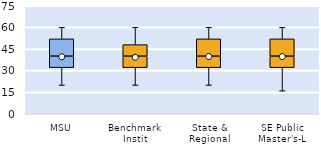
| Category | 25th | 50th | 75th |
|---|---|---|---|
| MSU | 32 | 8 | 12 |
| Benchmark Instit | 32 | 8 | 8 |
| State & Regional | 32 | 8 | 12 |
| SE Public Master's-L | 32 | 8 | 12 |